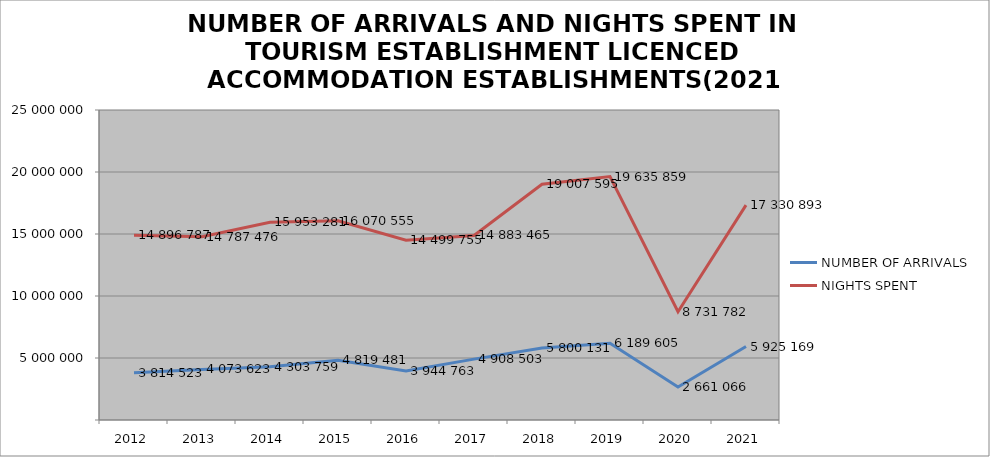
| Category | NUMBER OF ARRIVALS | NIGHTS SPENT |
|---|---|---|
| 2012 | 3814523 | 14896787 |
| 2013 | 4073623 | 14787476 |
| 2014 | 4303759 | 15953281 |
| 2015 | 4819481 | 16070555 |
| 2016 | 3944763 | 14499755 |
| 2017 | 4908503 | 14883465 |
| 2018 | 5800131 | 19007595 |
| 2019 | 6189605 | 19635859 |
| 2020 | 2661066 | 8731782 |
| 2021 | 5925169 | 17330893 |